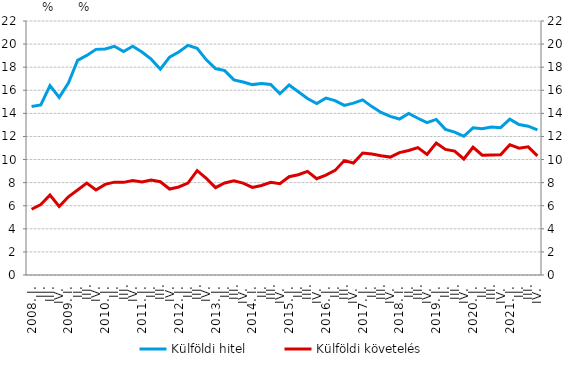
| Category | Külföldi hitel |
|---|---|
| 2008. I. | 14.599 |
| II. | 14.737 |
| III. | 16.409 |
| IV. | 15.382 |
| 2009. I. | 16.62 |
|          II. | 18.591 |
|          III. | 19.019 |
|          IV. | 19.544 |
| 2010. I. | 19.582 |
|          II. | 19.813 |
|          III. | 19.354 |
|          IV. | 19.808 |
| 2011. I. | 19.314 |
|          II. | 18.697 |
|          III. | 17.827 |
|          IV. | 18.869 |
| 2012. I. | 19.32 |
|          II. | 19.89 |
|          III. | 19.632 |
|          IV. | 18.636 |
| 2013. I. | 17.879 |
| II. | 17.702 |
|          III. | 16.904 |
| IV. | 16.716 |
| 2014. I. | 16.49 |
| II. | 16.576 |
|          III. | 16.508 |
| IV. | 15.7 |
| 2015. I. | 16.455 |
| II. | 15.873 |
|          III. | 15.284 |
| IV. | 14.857 |
| 2016. I. | 15.319 |
| II. | 15.106 |
|          III. | 14.694 |
| IV. | 14.889 |
| 2017. I. | 15.173 |
| II. | 14.587 |
|          III. | 14.075 |
| IV. | 13.741 |
| 2018. I. | 13.509 |
| II. | 13.993 |
|          III. | 13.574 |
| IV. | 13.195 |
| 2019. I. | 13.476 |
| II. | 12.613 |
|          III. | 12.38 |
| IV. | 12.014 |
| 2020. I. | 12.743 |
| II. | 12.673 |
|          III. | 12.816 |
| IV. | 12.758 |
| 2021. I. | 13.503 |
| II. | 13.027 |
|          III. | 12.886 |
| IV. | 12.573 |